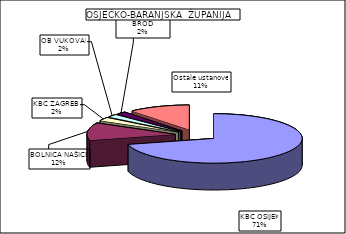
| Category | Series 0 |
|---|---|
| KBC OSIJEK | 71.089 |
| BOLNICA NAŠICE | 11.551 |
| KBC ZAGREB  | 2.401 |
| OB VUKOVAR | 1.952 |
| OB SLAVONSKI BROD | 1.805 |
| Ostale ustanove | 11.202 |